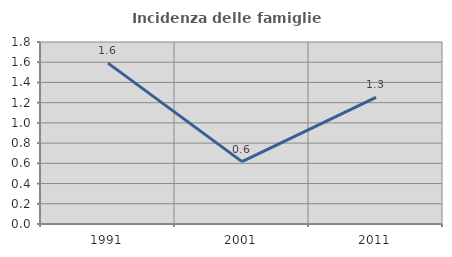
| Category | Incidenza delle famiglie numerose |
|---|---|
| 1991.0 | 1.591 |
| 2001.0 | 0.617 |
| 2011.0 | 1.251 |